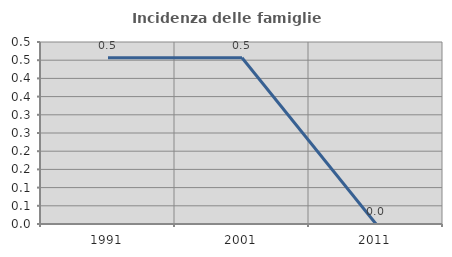
| Category | Incidenza delle famiglie numerose |
|---|---|
| 1991.0 | 0.457 |
| 2001.0 | 0.457 |
| 2011.0 | 0 |